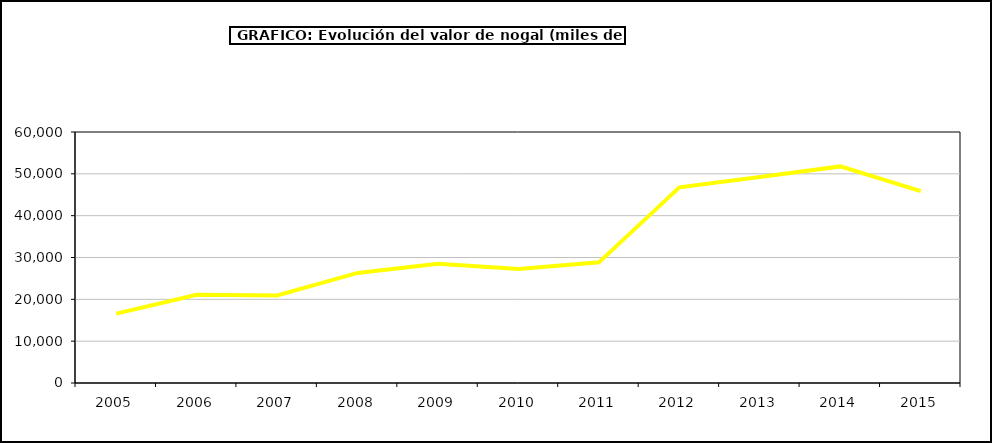
| Category | valor nogal |
|---|---|
| 2005.0 | 16588.39 |
| 2006.0 | 21082.074 |
| 2007.0 | 20930.205 |
| 2008.0 | 26319.546 |
| 2009.0 | 28498.427 |
| 2010.0 | 27232.257 |
| 2011.0 | 28841.576 |
| 2012.0 | 46777.981 |
| 2013.0 | 49217.301 |
| 2014.0 | 51776.04 |
| 2015.0 | 45857 |